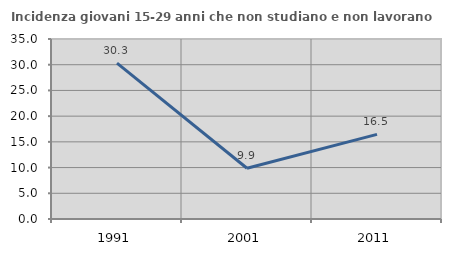
| Category | Incidenza giovani 15-29 anni che non studiano e non lavorano  |
|---|---|
| 1991.0 | 30.303 |
| 2001.0 | 9.868 |
| 2011.0 | 16.457 |